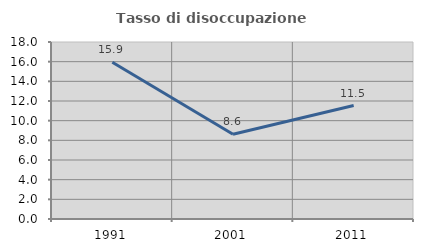
| Category | Tasso di disoccupazione giovanile  |
|---|---|
| 1991.0 | 15.942 |
| 2001.0 | 8.621 |
| 2011.0 | 11.538 |